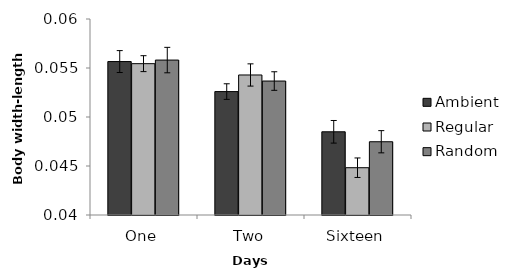
| Category | Ambient | Regular | Random |
|---|---|---|---|
| One | 0.056 | 0.055 | 0.056 |
| Two | 0.053 | 0.054 | 0.054 |
| Sixteen | 0.048 | 0.045 | 0.047 |